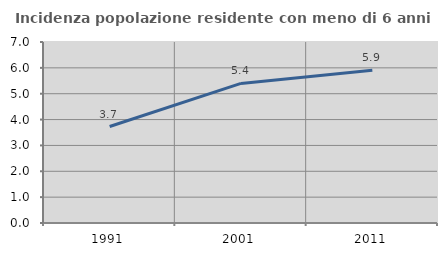
| Category | Incidenza popolazione residente con meno di 6 anni |
|---|---|
| 1991.0 | 3.731 |
| 2001.0 | 5.399 |
| 2011.0 | 5.91 |